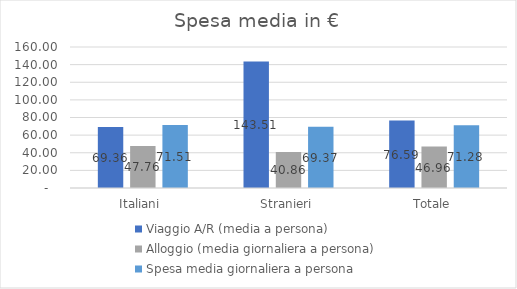
| Category | Viaggio A/R (media a persona) | Alloggio (media giornaliera a persona) | Spesa media giornaliera a persona |
|---|---|---|---|
| Italiani  | 69.359 | 47.757 | 71.511 |
| Stranieri | 143.509 | 40.858 | 69.366 |
| Totale | 76.593 | 46.956 | 71.281 |